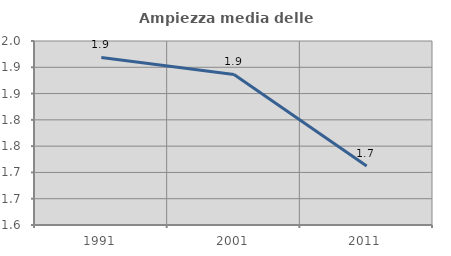
| Category | Ampiezza media delle famiglie |
|---|---|
| 1991.0 | 1.919 |
| 2001.0 | 1.886 |
| 2011.0 | 1.712 |